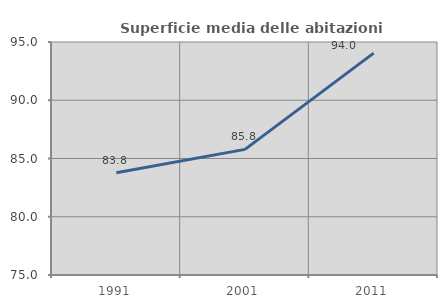
| Category | Superficie media delle abitazioni occupate |
|---|---|
| 1991.0 | 83.783 |
| 2001.0 | 85.782 |
| 2011.0 | 94.042 |